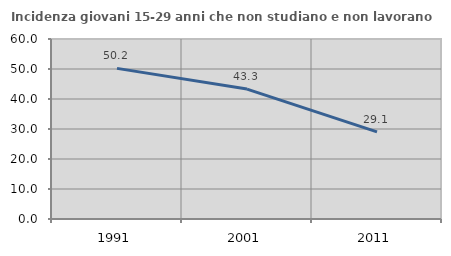
| Category | Incidenza giovani 15-29 anni che non studiano e non lavorano  |
|---|---|
| 1991.0 | 50.206 |
| 2001.0 | 43.308 |
| 2011.0 | 29.052 |